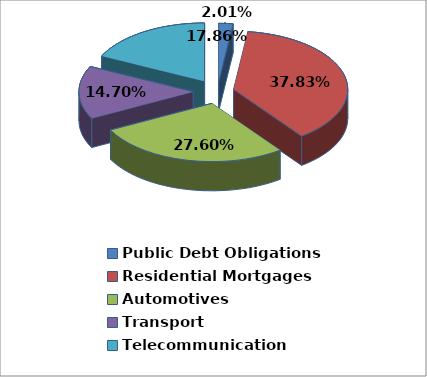
| Category | Series 0 |
|---|---|
| Public Debt Obligations | 0.02 |
| Residential Mortgages | 0.378 |
| Automotives | 0.276 |
| Transport | 0.147 |
| Telecommunication | 0.179 |